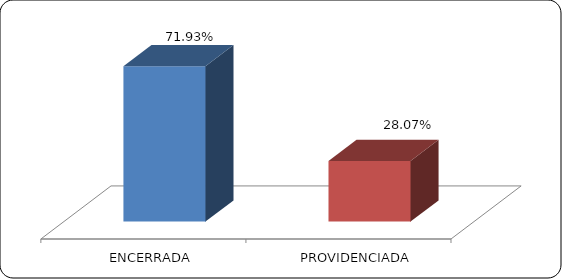
| Category | Series 0 |
|---|---|
|      ENCERRADA | 0.719 |
|      PROVIDENCIADA | 0.281 |